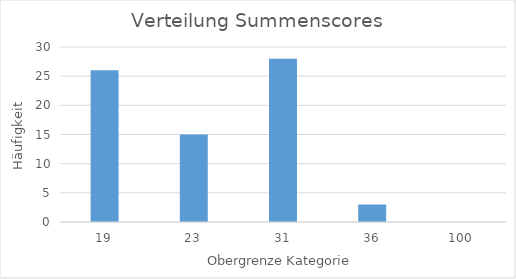
| Category | Series 0 |
|---|---|
| 19.0 | 26 |
| 23.0 | 15 |
| 31.0 | 28 |
| 36.0 | 3 |
| 100.0 | 0 |